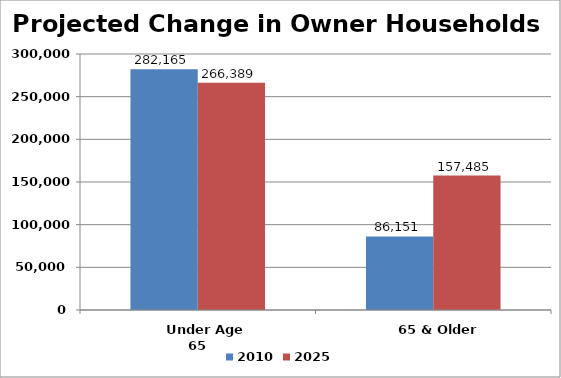
| Category | 2010 | 2025 |
|---|---|---|
|    Under Age 65 | 282165 | 266389.327 |
|    65 & Older | 86151 | 157485.164 |